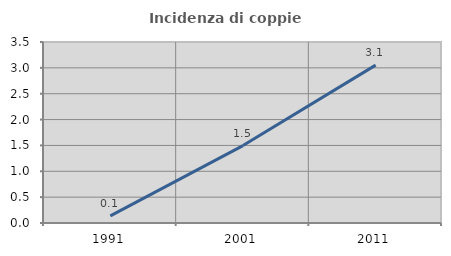
| Category | Incidenza di coppie miste |
|---|---|
| 1991.0 | 0.138 |
| 2001.0 | 1.498 |
| 2011.0 | 3.053 |